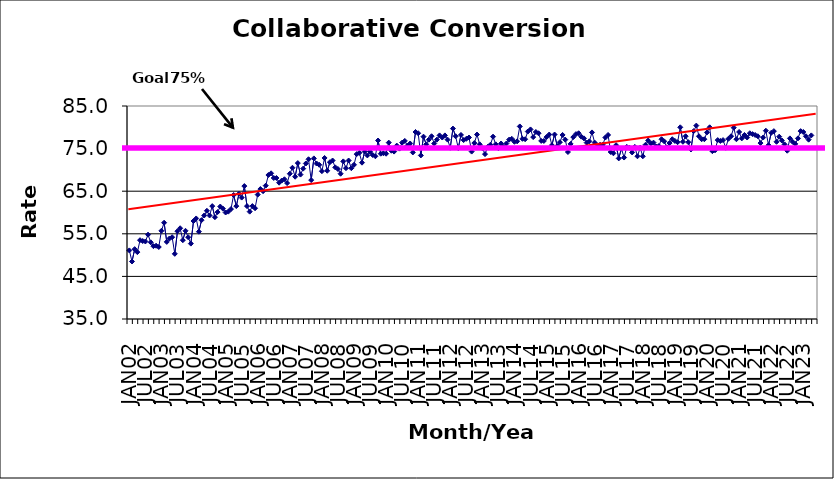
| Category | Series 0 |
|---|---|
| JAN02 | 51.1 |
| FEB02 | 48.5 |
| MAR02 | 51.4 |
| APR02 | 50.7 |
| MAY02 | 53.5 |
| JUN02 | 53.3 |
| JUL02 | 53.2 |
| AUG02 | 54.8 |
| SEP02 | 53 |
| OCT02 | 52.1 |
| NOV02 | 52.2 |
| DEC02 | 51.9 |
| JAN03 | 55.7 |
| FEB03 | 57.6 |
| MAR03 | 53.1 |
| APR03 | 53.9 |
| MAY03 | 54.2 |
| JUN03 | 50.3 |
| JUL03 | 55.6 |
| AUG03 | 56.3 |
| SEP03 | 53.5 |
| OCT03 | 55.7 |
| NOV03 | 54.2 |
| DEC03 | 52.7 |
| JAN04 | 58 |
| FEB04 | 58.6 |
| MAR04 | 55.5 |
| APR04 | 58.2 |
| MAY04 | 59.3 |
| JUN04 | 60.4 |
| JUL04 | 59.3 |
| AUG04 | 61.5 |
| SEP04 | 58.9 |
| OCT04 | 60.1 |
| NOV04 | 61.4 |
| DEC04 | 60.9 |
| JAN05 | 60 |
| FEB05 | 60.2 |
| MAR05 | 60.8 |
| APR05 | 64.1 |
| MAY05 | 61.5 |
| JUN05 | 64.4 |
| JUL05 | 63.5 |
| AUG05 | 66.2 |
| SEP05 | 61.5 |
| OCT05 | 60.2 |
| NOV05 | 61.5 |
| DEC05 | 61 |
| JAN06 | 64.2 |
| FEB06 | 65.5 |
| MAR06 | 65 |
| APR06 | 66.3 |
| MAY06 | 68.8 |
| JUN06 | 69.2 |
| JUL06 | 68.1 |
| AUG06 | 68.1 |
| SEP06 | 67 |
| OCT06 | 67.5 |
| NOV06 | 67.8 |
| DEC06 | 66.9 |
| JAN07 | 69.1 |
| FEB07 | 70.5 |
| MAR07 | 68.4 |
| APR07 | 71.6 |
| MAY07 | 68.9 |
| JUN07 | 70.3 |
| JUL07 | 71.5 |
| AUG07 | 72.5 |
| SEP07 | 67.6 |
| OCT07 | 72.7 |
| NOV07 | 71.5 |
| DEC07 | 71.2 |
| JAN08 | 69.7 |
| FEB08 | 72.8 |
| MAR08 | 69.8 |
| APR08 | 71.8 |
| MAY08 | 72.2 |
| JUN08 | 70.6 |
| JUL08 | 70.2 |
| AUG08 | 69.1 |
| SEP08 | 72 |
| OCT08 | 70.4 |
| NOV08 | 72.2 |
| DEC08 | 70.4 |
| JAN09 | 71.2 |
| FEB09 | 73.7 |
| MAR09 | 74 |
| APR09 | 71.7 |
| MAY09 | 74.3 |
| JUN09 | 73.4 |
| JUL09 | 74.3 |
| AUG09 | 73.5 |
| SEP09 | 73.2 |
| OCT09 | 76.9 |
| NOV09 | 73.8 |
| DEC09 | 73.9 |
| JAN10 | 73.8 |
| FEB10 | 76.4 |
| MAR10 | 74.5 |
| APR10 | 74.3 |
| MAY10 | 75.7 |
| JUN10 | 75 |
| JUL10 | 76.4 |
| AUG10 | 76.8 |
| SEP10 | 75.7 |
| OCT10 | 76.2 |
| NOV10 | 74.1 |
| DEC10 | 78.9 |
| JAN11 | 78.6 |
| FEB11 | 73.4 |
| MAR11 | 77.8 |
| APR11 | 76 |
| MAY11 | 77.1 |
| JUN11 | 77.9 |
| JUL11 | 76.2 |
| AUG11 | 77.1 |
| SEP11 | 78.1 |
| OCT11 | 77.6 |
| NOV11 | 78.1 |
| DEC11 | 77.1 |
| JAN12 | 75.2 |
| FEB12 | 79.7 |
| MAR12 | 77.9 |
| APR12 | 75.1 |
| MAY12 | 78.2 |
| JUN12 | 77 |
| JUL12 | 77.3 |
| AUG12 | 77.6 |
| SEP12 | 74.3 |
| OCT12 | 76.3 |
| NOV12 | 78.3 |
| DEC12 | 76 |
| JAN13 | 75.1 |
| FEB13 | 73.7 |
| MAR13 | 75.4 |
| APR13 | 75.9 |
| MAY13 | 77.8 |
| JUN13 | 76 |
| JUL13 | 75.1 |
| AUG13 | 76.2 |
| SEP13 | 75.4 |
| OCT13 | 76.2 |
| NOV13 | 77.1 |
| DEC13 | 77.3 |
| JAN14 | 76.6 |
| FEB14 | 76.7 |
| MAR14 | 80.2 |
| APR14 | 77.3 |
| MAY14 | 77.2 |
| JUN14 | 79 |
| JUL14 | 79.5 |
| AUG14 | 77.7 |
| SEP14 | 78.9 |
| OCT14 | 78.6 |
| NOV14 | 76.8 |
| DEC14 | 76.8 |
| JAN15 | 77.7 |
| FEB15 | 78.3 |
| MAR15 | 75.8 |
| APR15 | 78.3 |
| MAY15 | 75.6 |
| JUN15 | 76.5 |
| JUL15 | 78.2 |
| AUG15 | 77.1 |
| SEP15 | 74.2 |
| OCT15 | 76.1 |
| NOV15 | 77.7 |
| DEC15 | 78.4 |
| JAN16 | 78.6 |
| FEB16 | 77.8 |
| MAR16 | 77.4 |
| APR16 | 76.4 |
| MAY16 | 76.7 |
| JUN16 | 78.8 |
| JUL16 | 76.4 |
| AUG16 | 75.5 |
| SEP16 | 75.9 |
| OCT16 | 75.9 |
| NOV16 | 77.6 |
| DEC16 | 78.2 |
| JAN17 | 74.2 |
| FEB17 | 73.9 |
| MAR17 | 75.8 |
| APR17 | 72.7 |
| MAY17 | 75 |
| JUN17 | 72.9 |
| JUL17 | 75.4 |
| AUG17 | 75.2 |
| SEP17 | 74.1 |
| OCT17 | 75.4 |
| NOV17 | 73.2 |
| DEC17 | 75.2 |
| JAN18 | 73.2 |
| FEB18 | 75.9 |
| MAR18 | 76.9 |
| APR18 | 76.2 |
| MAY18 | 76.4 |
| JUN18 | 75.5 |
| JUL18 | 75.6 |
| AUG18 | 77.2 |
| SEP18 | 76.7 |
| OCT18 | 75.3 |
| NOV18 | 76.3 |
| DEC18 | 77.2 |
| JAN19 | 76.8 |
| FEB19 | 76.5 |
| MAR19 | 80 |
| APR19 | 76.6 |
| MAY19 | 77.9 |
| JUN19 | 76.5 |
| JUL19 | 74.8 |
| AUG19 | 79.1 |
| SEP19 | 80.4 |
| OCT19 | 77.9 |
| NOV19 | 77.2 |
| DEC19 | 77.2 |
| JAN20 | 78.8 |
| FEB20 | 80 |
| MAR20 | 74.4 |
| APR20 | 74.6 |
| MAY20 | 77 |
| JUN20 | 76.8 |
| JUL20 | 77 |
| AUG20 | 75.2 |
| SEP20 | 77.3 |
| OCT20 | 77.9 |
| NOV20 | 79.9 |
| DEC20 | 77.2 |
| JAN21 | 78.9 |
| FEB21 | 77.4 |
| MAR21 | 78.2 |
| APR21 | 77.6 |
| MAY21 | 78.6 |
| JUN21 | 78.4 |
| JUL21 | 78.2 |
| AUG21 | 77.9 |
| SEP21 | 76.3 |
| OCT21 | 77.6 |
| NOV21 | 79.2 |
| DEC21 | 75.8 |
| JAN22 | 78.7 |
| FEB22 | 79.1 |
| MAR22 | 76.6 |
| APR22 | 77.8 |
| MAY22 | 76.9 |
| JUN22 | 76 |
| JUL22 | 74.5 |
| AUG22 | 77.4 |
| SEP22 | 76.6 |
| OCT22 | 76.1 |
| NOV22 | 77.4 |
| DEC22 | 79.1 |
| JAN23 | 78.9 |
| FEB23 | 77.9 |
| MAR23 | 77.1 |
| APR23 | 78.1 |